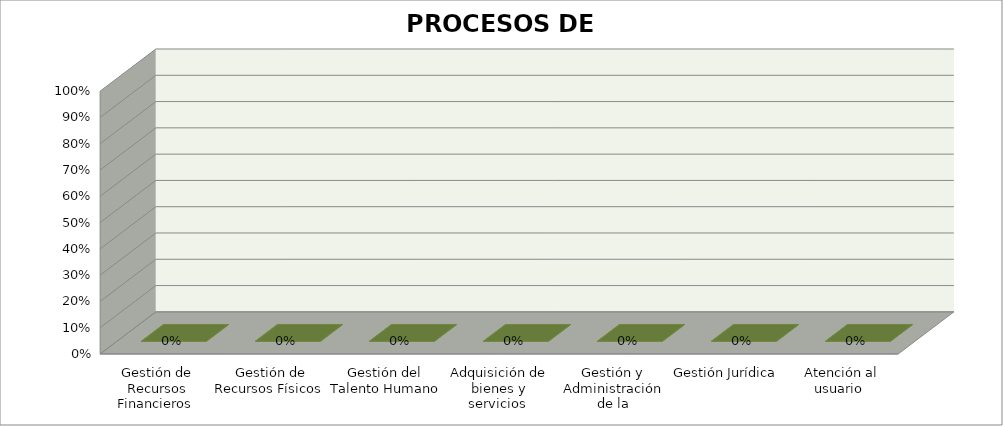
| Category | Series 0 |
|---|---|
| Gestión de Recursos Financieros  | 0 |
| Gestión de Recursos Físicos  | 0 |
| Gestión del Talento Humano  | 0 |
| Adquisición de bienes y servicios  | 0 |
| Gestión y Administración de la información  | 0 |
| Gestión Jurídica | 0 |
| Atención al usuario  | 0 |